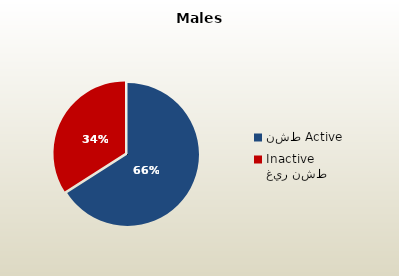
| Category | الذكور القطريين  Qatari Males |
|---|---|
| نشط Active | 71031 |
| غير نشط Inactive | 36633 |